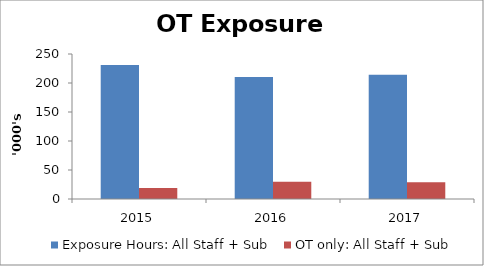
| Category | Exposure Hours: All Staff + Sub | OT only: All Staff + Sub |
|---|---|---|
| 2015.0 | 231066 | 18760 |
| 2016.0 | 210544 | 29652 |
| 2017.0 | 214425 | 28993 |